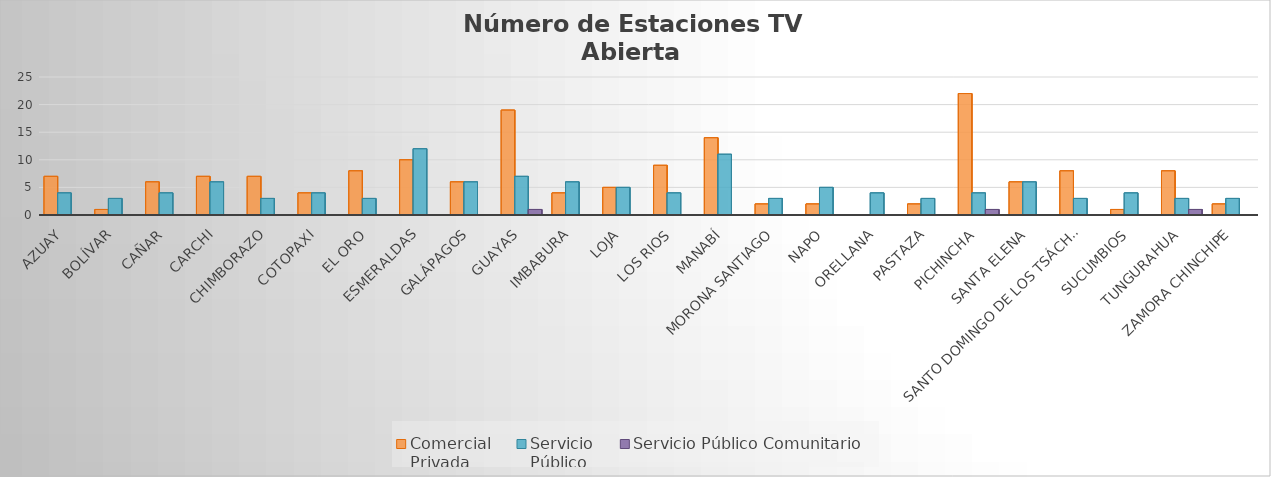
| Category | Comercial 
Privada | Servicio 
Público | Servicio Público Comunitario |
|---|---|---|---|
| Azuay | 7 | 4 | 0 |
| Bolívar | 1 | 3 | 0 |
| Cañar | 6 | 4 | 0 |
| Carchi | 7 | 6 | 0 |
| Chimborazo | 7 | 3 | 0 |
| Cotopaxi | 4 | 4 | 0 |
| El Oro | 8 | 3 | 0 |
| Esmeraldas | 10 | 12 | 0 |
| Galápagos | 6 | 6 | 0 |
| Guayas | 19 | 7 | 1 |
| Imbabura | 4 | 6 | 0 |
| Loja | 5 | 5 | 0 |
| Los Rios | 9 | 4 | 0 |
| Manabí | 14 | 11 | 0 |
| Morona Santiago | 2 | 3 | 0 |
| Napo | 2 | 5 | 0 |
| Orellana | 0 | 4 | 0 |
| Pastaza | 2 | 3 | 0 |
| Pichincha | 22 | 4 | 1 |
| Santa Elena | 6 | 6 | 0 |
| Santo Domingo de los Tsáchilas | 8 | 3 | 0 |
| Sucumbios | 1 | 4 | 0 |
| Tungurahua | 8 | 3 | 1 |
| Zamora Chinchipe | 2 | 3 | 0 |